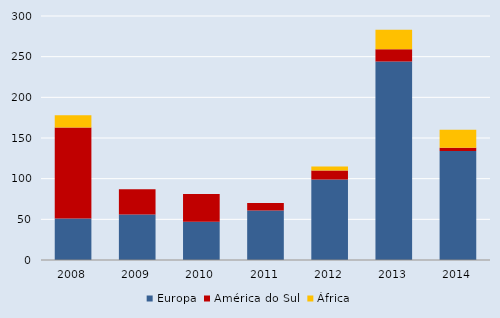
| Category | Europa | América do Sul  | África |
|---|---|---|---|
| 2008.0 | 51 | 112 | 15 |
| 2009.0 | 56 | 31 | 0 |
| 2010.0 | 47 | 34 | 0 |
| 2011.0 | 61 | 9 | 0 |
| 2012.0 | 99 | 11 | 5 |
| 2013.0 | 244 | 15 | 24 |
| 2014.0 | 134 | 4 | 22 |